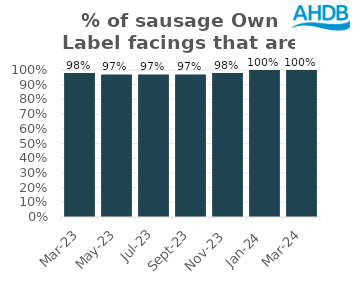
| Category | Sausage |
|---|---|
| 2023-03-01 | 0.98 |
| 2023-05-01 | 0.97 |
| 2023-07-01 | 0.97 |
| 2023-09-01 | 0.97 |
| 2023-11-01 | 0.98 |
| 2024-01-01 | 1 |
| 2024-03-01 | 1 |